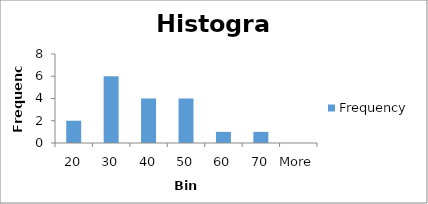
| Category | Frequency |
|---|---|
| 20 | 2 |
| 30 | 6 |
| 40 | 4 |
| 50 | 4 |
| 60 | 1 |
| 70 | 1 |
| More | 0 |